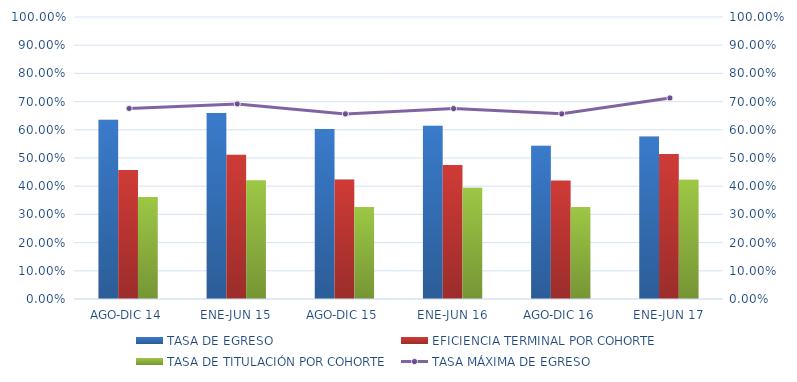
| Category | TASA DE EGRESO | EFICIENCIA TERMINAL POR COHORTE | TASA DE TITULACIÓN POR COHORTE |
|---|---|---|---|
| AGO-DIC 14 | 0.636 | 0.457 | 0.362 |
| ENE-JUN 15 | 0.659 | 0.511 | 0.421 |
| AGO-DIC 15 | 0.603 | 0.424 | 0.326 |
| ENE-JUN 16 | 0.615 | 0.475 | 0.394 |
| AGO-DIC 16 | 0.543 | 0.42 | 0.326 |
| ENE-JUN 17 | 0.576 | 0.514 | 0.423 |